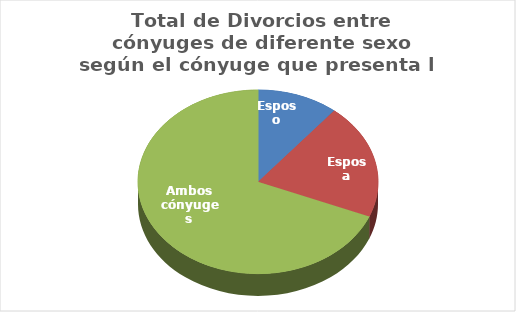
| Category | Series 0 |
|---|---|
| Esposo | 9297 |
| Esposa | 17238 |
| Ambos cónyuges | 58644 |